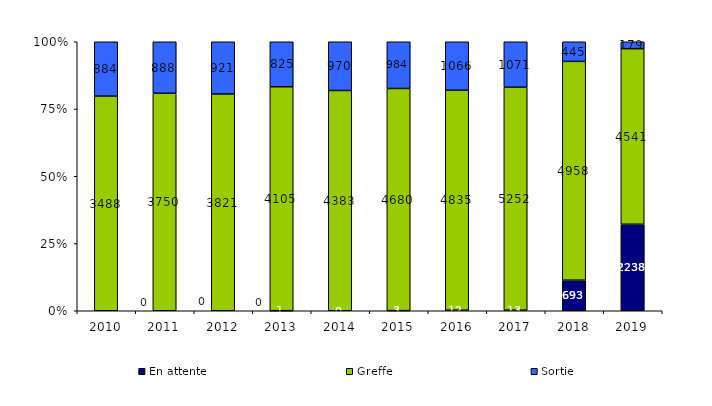
| Category | En attente | Greffe | Sortie |
|---|---|---|---|
| 2010.0 | 0 | 3488 | 884 |
| 2011.0 | 0 | 3750 | 888 |
| 2012.0 | 0 | 3821 | 921 |
| 2013.0 | 1 | 4105 | 825 |
| 2014.0 | 0 | 4383 | 970 |
| 2015.0 | 3 | 4680 | 984 |
| 2016.0 | 12 | 4835 | 1066 |
| 2017.0 | 13 | 5252 | 1071 |
| 2018.0 | 693 | 4958 | 445 |
| 2019.0 | 2238 | 4541 | 179 |